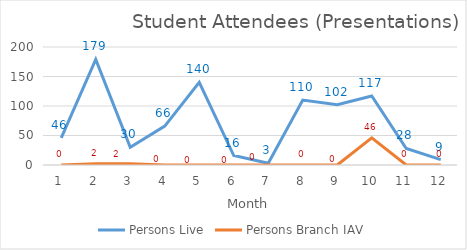
| Category | Persons Live | Persons Branch IAV |
|---|---|---|
| 0 | 46 | 0 |
| 1 | 179 | 2 |
| 2 | 30 | 2 |
| 3 | 66 | 0 |
| 4 | 140 | 0 |
| 5 | 16 | 0 |
| 6 | 3 | 0 |
| 7 | 110 | 0 |
| 8 | 102 | 0 |
| 9 | 117 | 46 |
| 10 | 28 | 0 |
| 11 | 9 | 0 |